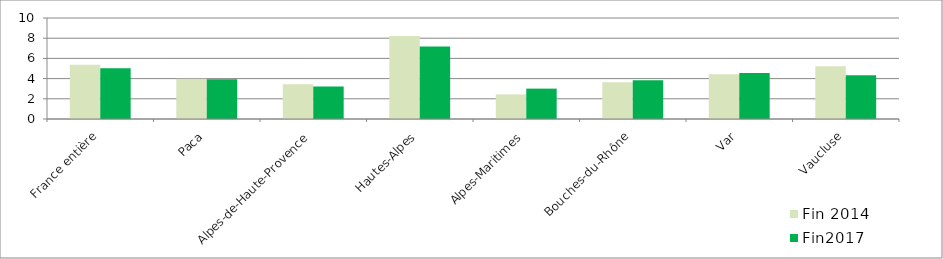
| Category | Fin 2014 | Fin2017 |
|---|---|---|
| France entière | 5.365 | 5.017 |
| Paca | 3.973 | 3.938 |
| Alpes-de-Haute-Provence | 3.448 | 3.229 |
| Hautes-Alpes | 8.23 | 7.186 |
| Alpes-Maritimes | 2.435 | 3.008 |
| Bouches-du-Rhône | 3.641 | 3.84 |
| Var | 4.425 | 4.543 |
| Vaucluse | 5.228 | 4.336 |